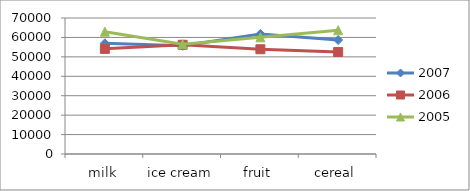
| Category | 2007 | 2006 | 2005 |
|---|---|---|---|
| milk | 56981 | 54117 | 62974 |
| ice cream | 55693 | 56222 | 56518 |
| fruit | 61816 | 53910 | 60047 |
| cereal | 58671 | 52489 | 63689 |